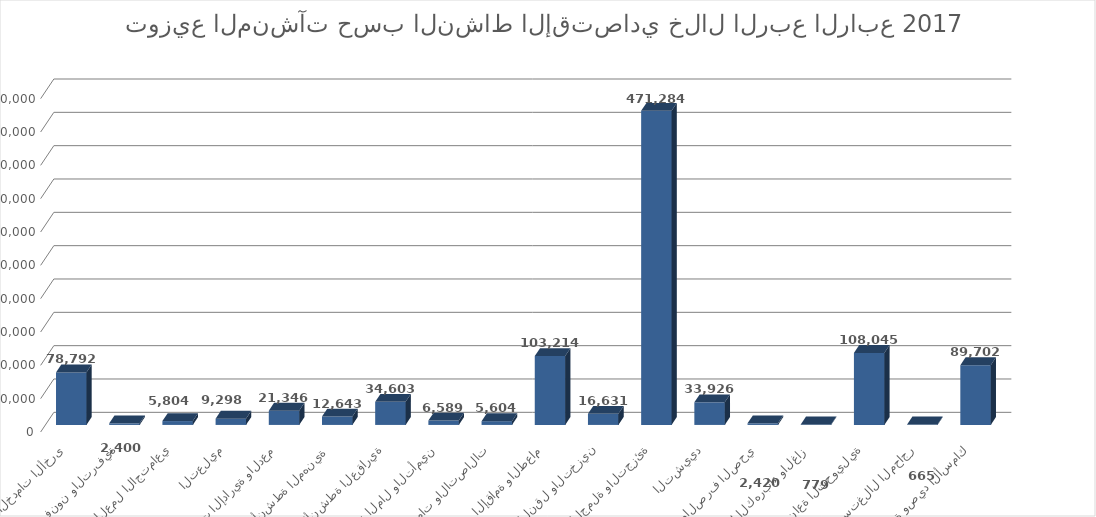
| Category | عدد المنشآت |
|---|---|
| الزراعة والحراجة وصيد الأسماك | 89702 |
| التعدين واستغلال المحاجر | 665 |
| الصناعة التحويلية | 108045 |
| توصيل الكهرباء والغاز  | 779 |
| امدادات الماء والصرف الصحي | 2420 |
| التشييد | 33926 |
| تجارة الجملة والتجزئة | 471284 |
| النقل والتخزين | 16631 |
| الإقامة والطعام | 103214 |
| المعلومات والاتصالات | 5604 |
| أنشطة المال والتأمين | 6589 |
| الأنشطة العقارية | 34603 |
| الأنشطة المهنية  | 12643 |
| الخدمات الإدارية والدعم | 21346 |
| التعليم | 9298 |
| الصحة والعمل الاجتماعي | 5804 |
| الفنون والترفية | 2400 |
| الخدمات الأخرى | 78792 |